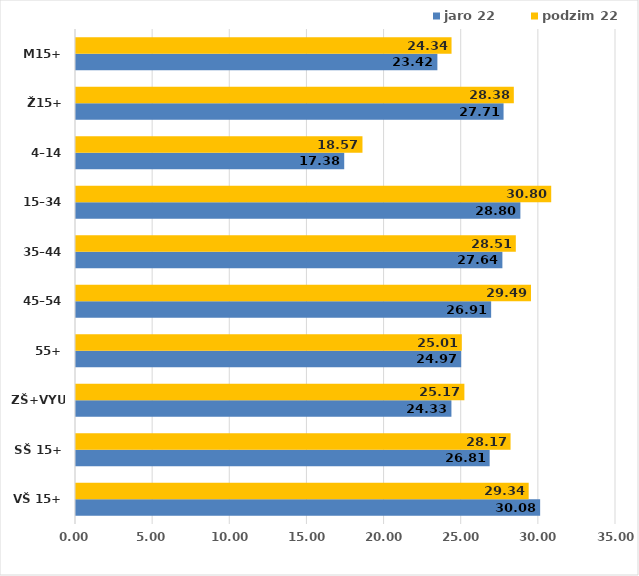
| Category | jaro 22 | podzim 22 |
|---|---|---|
| VŠ 15+ | 30.083 | 29.34 |
| SŠ 15+ | 26.811 | 28.166 |
| ZŠ+VYUČ | 24.333 | 25.173 |
| 55+ | 24.967 | 25.006 |
| 45–54 | 26.908 | 29.49 |
| 35–44 | 27.636 | 28.507 |
| 15–34 | 28.803 | 30.801 |
| 4–14 | 17.385 | 18.567 |
| Ž15+ | 27.712 | 28.378 |
| M15+ | 23.423 | 24.341 |